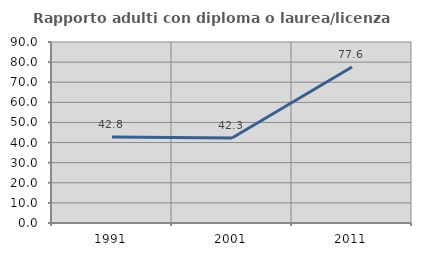
| Category | Rapporto adulti con diploma o laurea/licenza media  |
|---|---|
| 1991.0 | 42.763 |
| 2001.0 | 42.294 |
| 2011.0 | 77.592 |